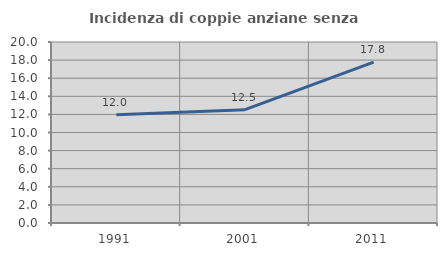
| Category | Incidenza di coppie anziane senza figli  |
|---|---|
| 1991.0 | 11.966 |
| 2001.0 | 12.523 |
| 2011.0 | 17.771 |